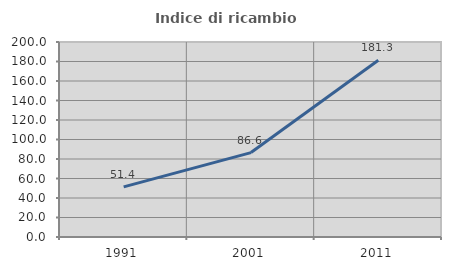
| Category | Indice di ricambio occupazionale  |
|---|---|
| 1991.0 | 51.412 |
| 2001.0 | 86.583 |
| 2011.0 | 181.279 |